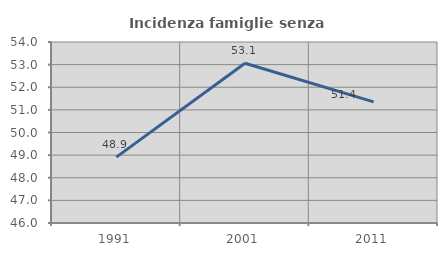
| Category | Incidenza famiglie senza nuclei |
|---|---|
| 1991.0 | 48.913 |
| 2001.0 | 53.061 |
| 2011.0 | 51.351 |